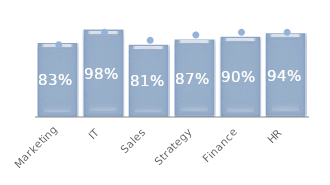
| Category | Series 0 |
|---|---|
| Marketing | 0.83 |
| IT | 0.98 |
| Sales | 0.81 |
| Strategy | 0.87 |
| Finance | 0.9 |
| HR | 0.94 |